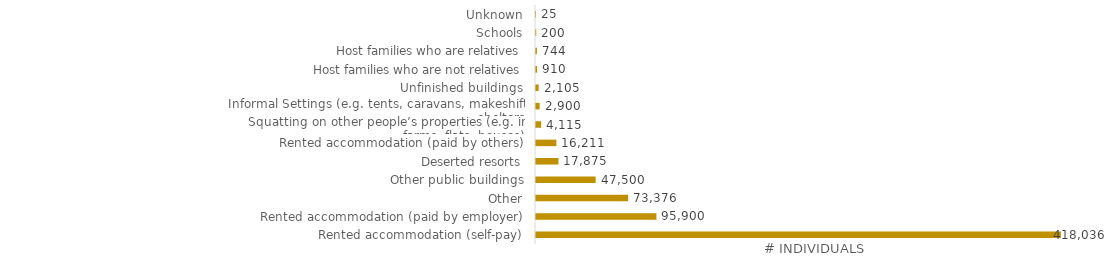
| Category | # Migrants (IND) |
|---|---|
| Rented accommodation (self-pay) | 418036 |
| Rented accommodation (paid by employer) | 95900 |
| Other | 73376 |
| Other public buildings | 47500 |
| Deserted resorts | 17875 |
| Rented accommodation (paid by others) | 16211 |
| Squatting on other people’s properties (e.g. in farms, flats, houses) | 4115 |
| Informal Settings (e.g. tents, caravans, makeshift shelters | 2900 |
| Unfinished buildings | 2105 |
| Host families who are not relatives | 910 |
| Host families who are relatives | 744 |
| Schools | 200 |
| Unknown | 25 |